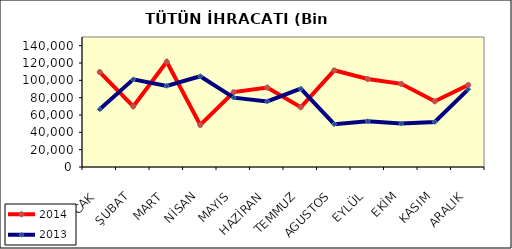
| Category | 2014 | 2013 |
|---|---|---|
| OCAK | 109576.344 | 66631.067 |
| ŞUBAT | 69920.359 | 101106.596 |
| MART | 121384.389 | 93632.384 |
| NİSAN | 48540.42 | 104726.342 |
| MAYIS | 86381.493 | 80015.084 |
| HAZİRAN | 91684.593 | 75654.788 |
| TEMMUZ | 68872.548 | 90331.686 |
| AGUSTOS | 111508.17 | 49399.683 |
| EYLÜL | 101496.207 | 52908.789 |
| EKİM | 95956.638 | 50115.952 |
| KASIM | 75721.907 | 51936.654 |
| ARALIK | 94615.249 | 89628.298 |